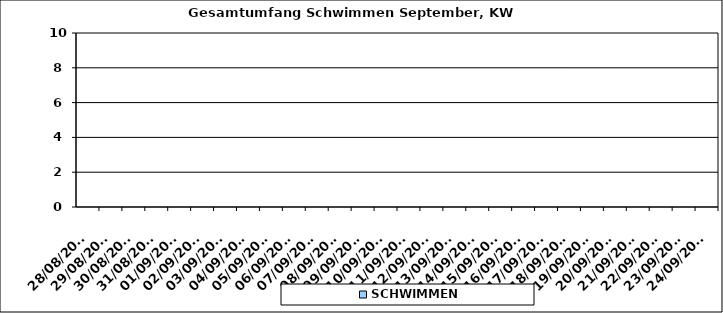
| Category | SCHWIMMEN |
|---|---|
| 28/08/2023 | 0 |
| 29/08/2023 | 0 |
| 30/08/2023 | 0 |
| 31/08/2023 | 0 |
| 01/09/2023 | 0 |
| 02/09/2023 | 0 |
| 03/09/2023 | 0 |
| 04/09/2023 | 0 |
| 05/09/2023 | 0 |
| 06/09/2023 | 0 |
| 07/09/2023 | 0 |
| 08/09/2023 | 0 |
| 09/09/2023 | 0 |
| 10/09/2023 | 0 |
| 11/09/2023 | 0 |
| 12/09/2023 | 0 |
| 13/09/2023 | 0 |
| 14/09/2023 | 0 |
| 15/09/2023 | 0 |
| 16/09/2023 | 0 |
| 17/09/2023 | 0 |
| 18/09/2023 | 0 |
| 19/09/2023 | 0 |
| 20/09/2023 | 0 |
| 21/09/2023 | 0 |
| 22/09/2023 | 0 |
| 23/09/2023 | 0 |
| 24/09/2023 | 0 |